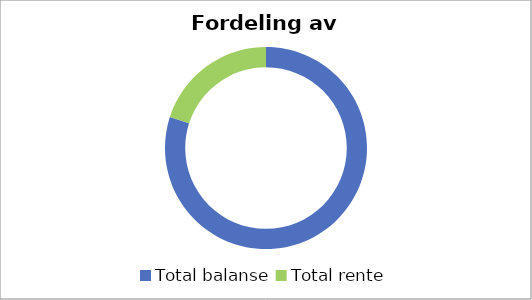
| Category | Series 0 |
|---|---|
| Total balanse | 2760000 |
| Total rente | 692242.22 |